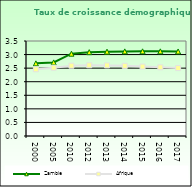
| Category | Zambie | Afrique                        |
|---|---|---|
| 2000.0 | 2.676 | 2.458 |
| 2005.0 | 2.712 | 2.516 |
| 2010.0 | 3.032 | 2.59 |
| 2012.0 | 3.089 | 2.606 |
| 2013.0 | 3.108 | 2.601 |
| 2014.0 | 3.117 | 2.584 |
| 2015.0 | 3.119 | 2.559 |
| 2016.0 | 3.119 | 2.531 |
| 2017.0 | 3.114 | 2.503 |